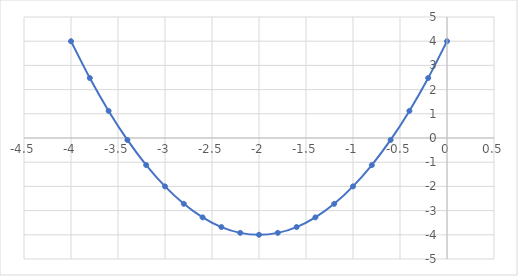
| Category | Zadanie: Przygotuj formuły do obliczania:                   - rozwiązań trójmianu kwadratowego,                 -  współrzędnych wierzchołka paraboli,    oraz przedstaw parabole na wykresie w przedziale xϵ [x_w2; x_w+2] |
|---|---|
| -4.0 | 4 |
| -3.8 | 2.48 |
| -3.5999999999999996 | 1.12 |
| -3.3999999999999995 | -0.08 |
| -3.1999999999999993 | -1.12 |
| -2.999999999999999 | -2 |
| -2.799999999999999 | -2.72 |
| -2.5999999999999988 | -3.28 |
| -2.3999999999999986 | -3.68 |
| -2.1999999999999984 | -3.92 |
| -1.9999999999999984 | -4 |
| -1.7999999999999985 | -3.92 |
| -1.5999999999999985 | -3.68 |
| -1.3999999999999986 | -3.28 |
| -1.1999999999999986 | -2.72 |
| -0.9999999999999987 | -2 |
| -0.7999999999999987 | -1.12 |
| -0.5999999999999988 | -0.08 |
| -0.39999999999999875 | 1.12 |
| -0.19999999999999873 | 2.48 |
| 1.27675647831893e-15 | 4 |